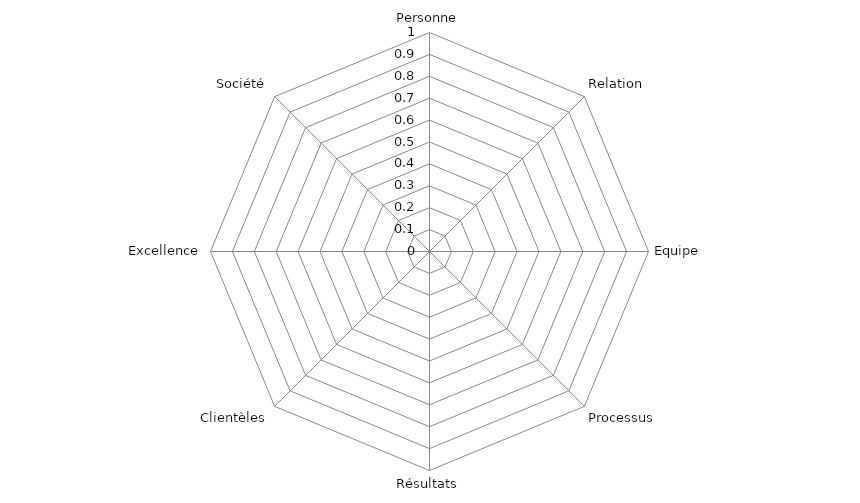
| Category | Series 0 |
|---|---|
| Personne | 0 |
| Relation | 0 |
| Equipe | 0 |
| Processus | 0 |
| Résultats | 0 |
| Clientèles | 0 |
| Excellence | 0 |
| Société | 0 |